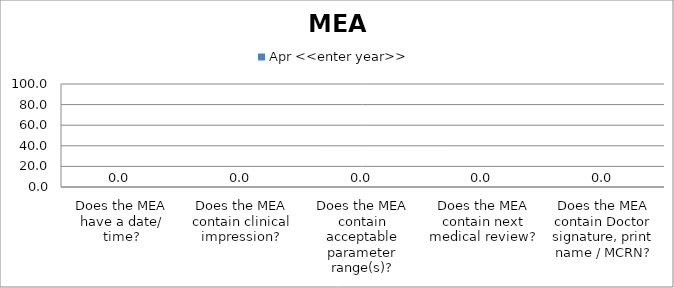
| Category | Apr <<enter year>> |
|---|---|
| Does the MEA have a date/ time? | 0 |
| Does the MEA contain clinical impression? | 0 |
| Does the MEA contain acceptable parameter range(s)? | 0 |
| Does the MEA contain next medical review? | 0 |
| Does the MEA contain Doctor signature, print name / MCRN? | 0 |